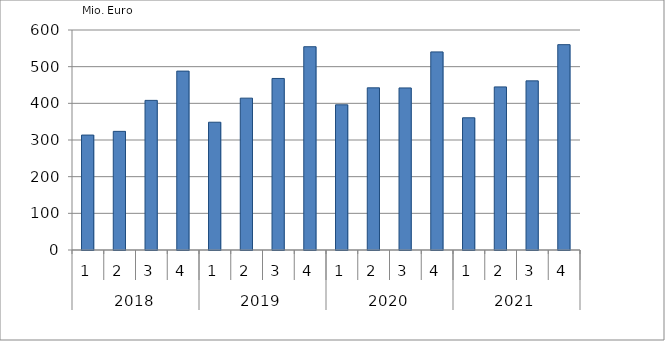
| Category | Ausbaugewerblicher Umsatz3 |
|---|---|
| 0 | 313433.569 |
| 1 | 323547.694 |
| 2 | 408057.42 |
| 3 | 487843.765 |
| 4 | 348466.115 |
| 5 | 414145.554 |
| 6 | 467849.207 |
| 7 | 554369.34 |
| 8 | 395996.128 |
| 9 | 442270.528 |
| 10 | 441987.109 |
| 11 | 540250.513 |
| 12 | 360578.959 |
| 13 | 444796.964 |
| 14 | 461290.095 |
| 15 | 559989.337 |